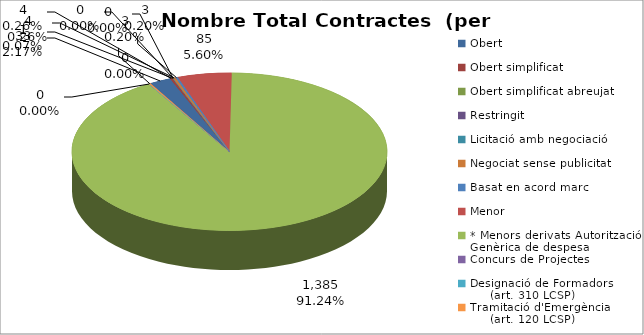
| Category | Nombre Total Contractes |
|---|---|
| Obert | 33 |
| Obert simplificat | 4 |
| Obert simplificat abreujat | 1 |
| Restringit | 0 |
| Licitació amb negociació | 0 |
| Negociat sense publicitat | 4 |
| Basat en acord marc | 3 |
| Menor | 85 |
| * Menors derivats Autorització Genèrica de despesa | 1385 |
| Concurs de Projectes | 0 |
| Designació de Formadors
     (art. 310 LCSP) | 0 |
| Tramitació d'Emergència
     (art. 120 LCSP) | 3 |